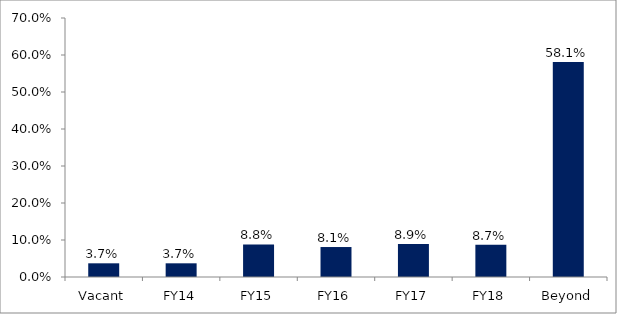
| Category | Series 0 |
|---|---|
| Vacant | 0.037 |
| FY14 | 0.037 |
| FY15 | 0.088 |
| FY16 | 0.081 |
| FY17 | 0.089 |
| FY18 | 0.087 |
| Beyond | 0.581 |